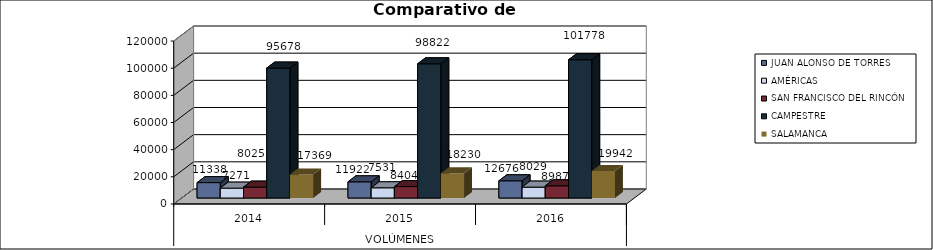
| Category | JUAN ALONSO DE TORRES | AMÉRICAS | SAN FRANCISCO DEL RINCÓN | CAMPESTRE | SALAMANCA |
|---|---|---|---|---|---|
| 0 | 11338 | 7271 | 8025 | 95678 | 17369 |
| 1 | 11922 | 7531 | 8404 | 98822 | 18230 |
| 2 | 12676 | 8029 | 8987 | 101778 | 19942 |